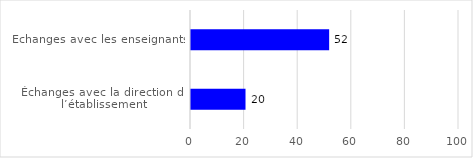
| Category | Series 0 |
|---|---|
| Échanges avec les enseignants | 51.55 |
| Échanges avec la direction de l’établissement | 20.34 |